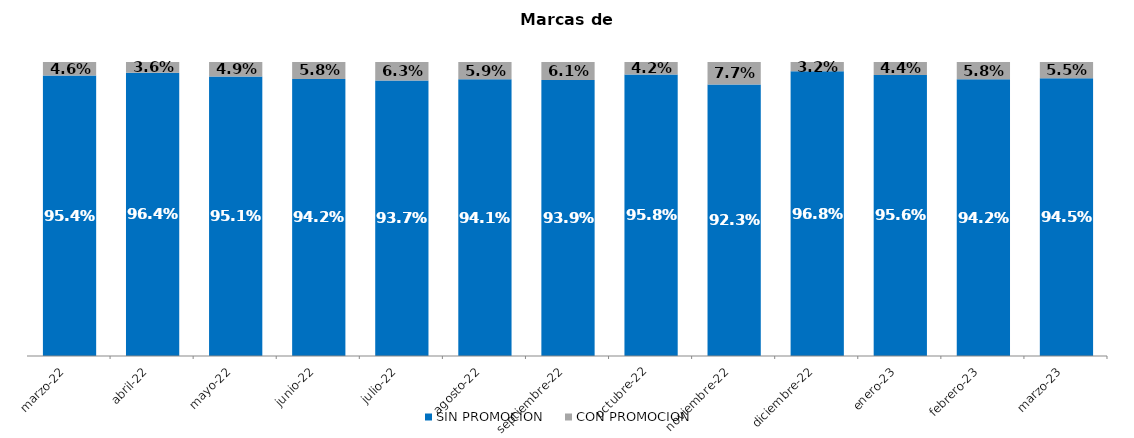
| Category | SIN PROMOCION   | CON PROMOCION   |
|---|---|---|
| 2022-03-01 | 0.954 | 0.046 |
| 2022-04-01 | 0.964 | 0.036 |
| 2022-05-01 | 0.951 | 0.049 |
| 2022-06-01 | 0.942 | 0.058 |
| 2022-07-01 | 0.937 | 0.063 |
| 2022-08-01 | 0.941 | 0.059 |
| 2022-09-01 | 0.939 | 0.061 |
| 2022-10-01 | 0.958 | 0.042 |
| 2022-11-01 | 0.923 | 0.077 |
| 2022-12-01 | 0.968 | 0.032 |
| 2023-01-01 | 0.956 | 0.044 |
| 2023-02-01 | 0.942 | 0.058 |
| 2023-03-01 | 0.945 | 0.055 |